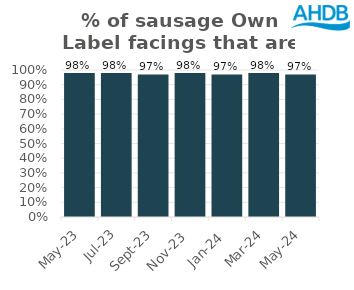
| Category | Sausage |
|---|---|
| 2023-05-01 | 0.98 |
| 2023-07-01 | 0.98 |
| 2023-09-01 | 0.97 |
| 2023-11-01 | 0.98 |
| 2024-01-01 | 0.97 |
| 2024-03-01 | 0.98 |
| 2024-05-01 | 0.97 |